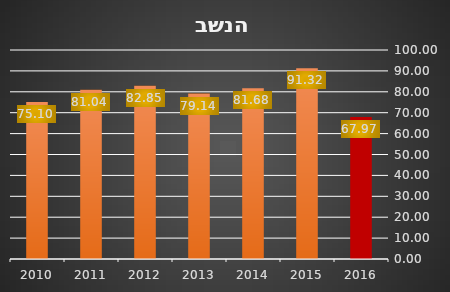
| Category | Series 1 |
|---|---|
| 2016.0 | 67.971 |
| 2015.0 | 91.323 |
| 2014.0 | 81.683 |
| 2013.0 | 79.144 |
| 2012.0 | 82.855 |
| 2011.0 | 81.036 |
| 2010.0 | 75.096 |